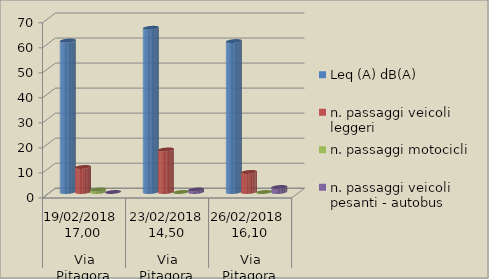
| Category | Leq (A) dB(A) | n. passaggi veicoli leggeri  | n. passaggi motocicli | n. passaggi veicoli pesanti - autobus  |
|---|---|---|---|---|
| 0 | 60.5 | 10 | 1 | 0 |
| 1 | 65.6 | 17 | 0 | 1 |
| 2 | 60.3 | 8 | 0 | 2 |